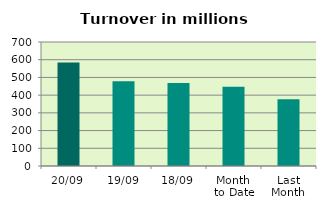
| Category | Series 0 |
|---|---|
| 20/09 | 584.49 |
| 19/09 | 477.805 |
| 18/09 | 468.716 |
| Month 
to Date | 447.694 |
| Last
Month | 376.258 |